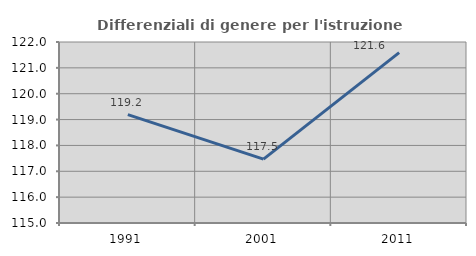
| Category | Differenziali di genere per l'istruzione superiore |
|---|---|
| 1991.0 | 119.193 |
| 2001.0 | 117.473 |
| 2011.0 | 121.589 |